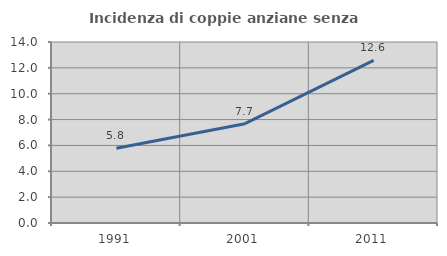
| Category | Incidenza di coppie anziane senza figli  |
|---|---|
| 1991.0 | 5.779 |
| 2001.0 | 7.681 |
| 2011.0 | 12.58 |